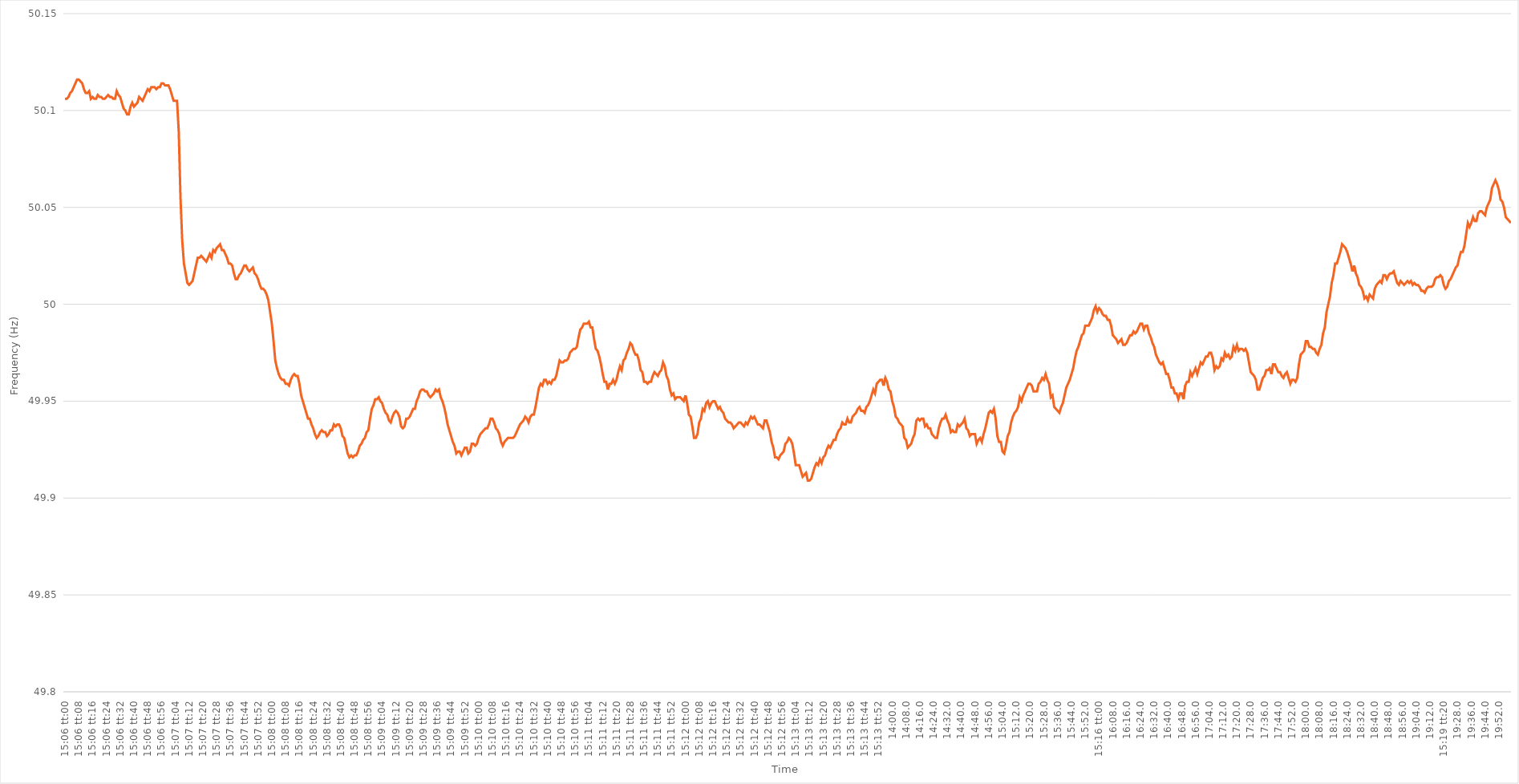
| Category | Series 0 |
|---|---|
| 0.6291666666666667 | 50.106 |
| 0.6291782407407408 | 50.106 |
| 0.6291898148148148 | 50.107 |
| 0.6292013888888889 | 50.109 |
| 0.6292129629629629 | 50.11 |
| 0.6292245370370371 | 50.112 |
| 0.6292361111111111 | 50.114 |
| 0.6292476851851853 | 50.116 |
| 0.6292592592592593 | 50.116 |
| 0.6292708333333333 | 50.115 |
| 0.6292824074074074 | 50.114 |
| 0.6292939814814814 | 50.111 |
| 0.6293055555555556 | 50.109 |
| 0.6293171296296296 | 50.109 |
| 0.6293287037037038 | 50.11 |
| 0.6293402777777778 | 50.106 |
| 0.6293518518518518 | 50.107 |
| 0.6293634259259259 | 50.106 |
| 0.629375 | 50.106 |
| 0.6293865740740741 | 50.108 |
| 0.6293981481481482 | 50.107 |
| 0.6294097222222222 | 50.107 |
| 0.6294212962962963 | 50.106 |
| 0.6294328703703703 | 50.106 |
| 0.6294444444444445 | 50.107 |
| 0.6294560185185185 | 50.108 |
| 0.6294675925925927 | 50.107 |
| 0.6294791666666667 | 50.107 |
| 0.6294907407407407 | 50.106 |
| 0.6295023148148148 | 50.106 |
| 0.6295138888888888 | 50.11 |
| 0.629525462962963 | 50.108 |
| 0.629537037037037 | 50.107 |
| 0.6295486111111112 | 50.104 |
| 0.6295601851851852 | 50.101 |
| 0.6295717592592592 | 50.1 |
| 0.6295833333333333 | 50.098 |
| 0.6295949074074074 | 50.098 |
| 0.6296064814814815 | 50.102 |
| 0.6296180555555556 | 50.104 |
| 0.6296296296296297 | 50.102 |
| 0.6296412037037037 | 50.103 |
| 0.6296527777777777 | 50.104 |
| 0.6296643518518519 | 50.107 |
| 0.6296759259259259 | 50.106 |
| 0.6296875000000001 | 50.105 |
| 0.6296990740740741 | 50.107 |
| 0.6297106481481481 | 50.109 |
| 0.6297222222222222 | 50.111 |
| 0.6297337962962963 | 50.11 |
| 0.6297453703703704 | 50.112 |
| 0.6297569444444444 | 50.112 |
| 0.6297685185185186 | 50.112 |
| 0.6297800925925926 | 50.111 |
| 0.6297916666666666 | 50.112 |
| 0.6298032407407407 | 50.112 |
| 0.6298148148148148 | 50.114 |
| 0.6298263888888889 | 50.114 |
| 0.629837962962963 | 50.113 |
| 0.629849537037037 | 50.113 |
| 0.6298611111111111 | 50.113 |
| 0.6298726851851851 | 50.111 |
| 0.6298842592592593 | 50.108 |
| 0.6298958333333333 | 50.105 |
| 0.6299074074074075 | 50.105 |
| 0.6299189814814815 | 50.105 |
| 0.6299305555555555 | 50.089 |
| 0.6299421296296296 | 50.055 |
| 0.6299537037037037 | 50.033 |
| 0.6299652777777778 | 50.021 |
| 0.6299768518518518 | 50.016 |
| 0.629988425925926 | 50.011 |
| 0.63 | 50.01 |
| 0.630011574074074 | 50.011 |
| 0.6300231481481481 | 50.012 |
| 0.6300347222222222 | 50.016 |
| 0.6300462962962963 | 50.02 |
| 0.6300578703703704 | 50.024 |
| 0.6300694444444445 | 50.024 |
| 0.6300810185185185 | 50.025 |
| 0.6300925925925925 | 50.024 |
| 0.6301041666666667 | 50.023 |
| 0.6301157407407407 | 50.022 |
| 0.6301273148148149 | 50.024 |
| 0.6301388888888889 | 50.026 |
| 0.630150462962963 | 50.024 |
| 0.630162037037037 | 50.028 |
| 0.6301736111111111 | 50.027 |
| 0.6301851851851852 | 50.029 |
| 0.6301967592592593 | 50.03 |
| 0.6302083333333334 | 50.031 |
| 0.6302199074074074 | 50.028 |
| 0.6302314814814814 | 50.028 |
| 0.6302430555555555 | 50.026 |
| 0.6302546296296296 | 50.024 |
| 0.6302662037037037 | 50.021 |
| 0.6302777777777778 | 50.021 |
| 0.6302893518518519 | 50.02 |
| 0.6303009259259259 | 50.016 |
| 0.6303124999999999 | 50.013 |
| 0.6303240740740741 | 50.013 |
| 0.6303356481481481 | 50.015 |
| 0.6303472222222223 | 50.016 |
| 0.6303587962962963 | 50.018 |
| 0.6303703703703704 | 50.02 |
| 0.6303819444444444 | 50.02 |
| 0.6303935185185185 | 50.018 |
| 0.6304050925925926 | 50.017 |
| 0.6304166666666667 | 50.018 |
| 0.6304282407407408 | 50.019 |
| 0.6304398148148148 | 50.016 |
| 0.6304513888888889 | 50.015 |
| 0.6304629629629629 | 50.013 |
| 0.630474537037037 | 50.01 |
| 0.6304861111111111 | 50.008 |
| 0.6304976851851852 | 50.008 |
| 0.6305092592592593 | 50.007 |
| 0.6305208333333333 | 50.005 |
| 0.6305324074074073 | 50.002 |
| 0.6305439814814815 | 49.996 |
| 0.6305555555555555 | 49.99 |
| 0.6305671296296297 | 49.981 |
| 0.6305787037037037 | 49.971 |
| 0.6305902777777778 | 49.967 |
| 0.6306018518518518 | 49.964 |
| 0.630613425925926 | 49.962 |
| 0.630625 | 49.961 |
| 0.6306365740740741 | 49.961 |
| 0.6306481481481482 | 49.959 |
| 0.6306597222222222 | 49.959 |
| 0.6306712962962963 | 49.958 |
| 0.6306828703703703 | 49.961 |
| 0.6306944444444444 | 49.963 |
| 0.6307060185185185 | 49.964 |
| 0.6307175925925926 | 49.963 |
| 0.6307291666666667 | 49.963 |
| 0.6307407407407407 | 49.959 |
| 0.6307523148148148 | 49.953 |
| 0.6307638888888889 | 49.95 |
| 0.6307754629629629 | 49.947 |
| 0.6307870370370371 | 49.944 |
| 0.6307986111111111 | 49.941 |
| 0.6308101851851852 | 49.941 |
| 0.6308217592592592 | 49.938 |
| 0.6308333333333334 | 49.936 |
| 0.6308449074074074 | 49.933 |
| 0.6308564814814815 | 49.931 |
| 0.6308680555555556 | 49.932 |
| 0.6308796296296296 | 49.934 |
| 0.6308912037037037 | 49.935 |
| 0.6309027777777778 | 49.934 |
| 0.6309143518518519 | 49.934 |
| 0.6309259259259259 | 49.932 |
| 0.6309375 | 49.933 |
| 0.6309490740740741 | 49.935 |
| 0.6309606481481481 | 49.935 |
| 0.6309722222222222 | 49.938 |
| 0.6309837962962963 | 49.937 |
| 0.6309953703703703 | 49.938 |
| 0.6310069444444445 | 49.938 |
| 0.6310185185185185 | 49.936 |
| 0.6310300925925926 | 49.932 |
| 0.6310416666666666 | 49.931 |
| 0.6310532407407408 | 49.927 |
| 0.6310648148148148 | 49.923 |
| 0.631076388888889 | 49.921 |
| 0.631087962962963 | 49.922 |
| 0.631099537037037 | 49.921 |
| 0.6311111111111111 | 49.922 |
| 0.6311226851851852 | 49.922 |
| 0.6311342592592593 | 49.924 |
| 0.6311458333333334 | 49.927 |
| 0.6311574074074074 | 49.928 |
| 0.6311689814814815 | 49.93 |
| 0.6311805555555555 | 49.931 |
| 0.6311921296296296 | 49.934 |
| 0.6312037037037037 | 49.935 |
| 0.6312152777777778 | 49.941 |
| 0.6312268518518519 | 49.946 |
| 0.6312384259259259 | 49.948 |
| 0.63125 | 49.951 |
| 0.631261574074074 | 49.951 |
| 0.6312731481481482 | 49.952 |
| 0.6312847222222222 | 49.95 |
| 0.6312962962962964 | 49.949 |
| 0.6313078703703704 | 49.946 |
| 0.6313194444444444 | 49.944 |
| 0.6313310185185185 | 49.943 |
| 0.6313425925925926 | 49.94 |
| 0.6313541666666667 | 49.939 |
| 0.6313657407407408 | 49.942 |
| 0.6313773148148148 | 49.944 |
| 0.6313888888888889 | 49.945 |
| 0.6314004629629629 | 49.944 |
| 0.631412037037037 | 49.942 |
| 0.6314236111111111 | 49.937 |
| 0.6314351851851852 | 49.936 |
| 0.6314467592592593 | 49.937 |
| 0.6314583333333333 | 49.941 |
| 0.6314699074074074 | 49.941 |
| 0.6314814814814814 | 49.942 |
| 0.6314930555555556 | 49.944 |
| 0.6315046296296296 | 49.946 |
| 0.6315162037037038 | 49.946 |
| 0.6315277777777778 | 49.95 |
| 0.6315393518518518 | 49.952 |
| 0.6315509259259259 | 49.955 |
| 0.6315625 | 49.956 |
| 0.6315740740740741 | 49.956 |
| 0.6315856481481482 | 49.955 |
| 0.6315972222222223 | 49.955 |
| 0.6316087962962963 | 49.953 |
| 0.6316203703703703 | 49.952 |
| 0.6316319444444445 | 49.953 |
| 0.6316435185185185 | 49.954 |
| 0.6316550925925926 | 49.956 |
| 0.6316666666666667 | 49.955 |
| 0.6316782407407407 | 49.956 |
| 0.6316898148148148 | 49.952 |
| 0.6317013888888888 | 49.95 |
| 0.631712962962963 | 49.947 |
| 0.631724537037037 | 49.943 |
| 0.6317361111111112 | 49.938 |
| 0.6317476851851852 | 49.935 |
| 0.6317592592592592 | 49.932 |
| 0.6317708333333333 | 49.929 |
| 0.6317824074074074 | 49.927 |
| 0.6317939814814815 | 49.923 |
| 0.6318055555555556 | 49.924 |
| 0.6318171296296297 | 49.924 |
| 0.6318287037037037 | 49.922 |
| 0.6318402777777777 | 49.924 |
| 0.6318518518518519 | 49.926 |
| 0.6318634259259259 | 49.926 |
| 0.631875 | 49.923 |
| 0.6318865740740741 | 49.924 |
| 0.6318981481481482 | 49.928 |
| 0.6319097222222222 | 49.928 |
| 0.6319212962962962 | 49.927 |
| 0.6319328703703704 | 49.928 |
| 0.6319444444444444 | 49.931 |
| 0.6319560185185186 | 49.933 |
| 0.6319675925925926 | 49.934 |
| 0.6319791666666666 | 49.935 |
| 0.6319907407407407 | 49.936 |
| 0.6320023148148148 | 49.936 |
| 0.6320138888888889 | 49.938 |
| 0.632025462962963 | 49.941 |
| 0.6320370370370371 | 49.941 |
| 0.6320486111111111 | 49.939 |
| 0.6320601851851851 | 49.936 |
| 0.6320717592592593 | 49.935 |
| 0.6320833333333333 | 49.933 |
| 0.6320949074074075 | 49.929 |
| 0.6321064814814815 | 49.927 |
| 0.6321180555555556 | 49.929 |
| 0.6321296296296296 | 49.93 |
| 0.6321412037037036 | 49.931 |
| 0.6321527777777778 | 49.931 |
| 0.6321643518518518 | 49.931 |
| 0.632175925925926 | 49.931 |
| 0.6321875 | 49.932 |
| 0.632199074074074 | 49.934 |
| 0.6322106481481481 | 49.936 |
| 0.6322222222222222 | 49.938 |
| 0.6322337962962963 | 49.939 |
| 0.6322453703703704 | 49.94 |
| 0.6322569444444445 | 49.942 |
| 0.6322685185185185 | 49.941 |
| 0.6322800925925925 | 49.939 |
| 0.6322916666666667 | 49.942 |
| 0.6323032407407407 | 49.943 |
| 0.6323148148148149 | 49.943 |
| 0.6323263888888889 | 49.947 |
| 0.632337962962963 | 49.952 |
| 0.632349537037037 | 49.957 |
| 0.632361111111111 | 49.959 |
| 0.6323726851851852 | 49.958 |
| 0.6323842592592592 | 49.961 |
| 0.6323958333333334 | 49.961 |
| 0.6324074074074074 | 49.959 |
| 0.6324189814814815 | 49.96 |
| 0.6324305555555555 | 49.959 |
| 0.6324421296296296 | 49.961 |
| 0.6324537037037037 | 49.961 |
| 0.6324652777777778 | 49.963 |
| 0.6324768518518519 | 49.967 |
| 0.6324884259259259 | 49.971 |
| 0.6325 | 49.97 |
| 0.6325115740740741 | 49.97 |
| 0.6325231481481481 | 49.971 |
| 0.6325347222222223 | 49.971 |
| 0.6325462962962963 | 49.972 |
| 0.6325578703703704 | 49.975 |
| 0.6325694444444444 | 49.976 |
| 0.6325810185185184 | 49.977 |
| 0.6325925925925926 | 49.977 |
| 0.6326041666666666 | 49.978 |
| 0.6326157407407408 | 49.983 |
| 0.6326273148148148 | 49.987 |
| 0.6326388888888889 | 49.988 |
| 0.6326504629629629 | 49.99 |
| 0.632662037037037 | 49.99 |
| 0.6326736111111111 | 49.99 |
| 0.6326851851851852 | 49.991 |
| 0.6326967592592593 | 49.988 |
| 0.6327083333333333 | 49.988 |
| 0.6327199074074074 | 49.982 |
| 0.6327314814814815 | 49.977 |
| 0.6327430555555555 | 49.976 |
| 0.6327546296296297 | 49.973 |
| 0.6327662037037037 | 49.969 |
| 0.6327777777777778 | 49.964 |
| 0.6327893518518518 | 49.96 |
| 0.632800925925926 | 49.96 |
| 0.6328125 | 49.956 |
| 0.632824074074074 | 49.959 |
| 0.6328356481481482 | 49.959 |
| 0.6328472222222222 | 49.961 |
| 0.6328587962962963 | 49.959 |
| 0.6328703703703703 | 49.961 |
| 0.6328819444444445 | 49.965 |
| 0.6328935185185185 | 49.968 |
| 0.6329050925925926 | 49.966 |
| 0.6329166666666667 | 49.971 |
| 0.6329282407407407 | 49.972 |
| 0.6329398148148148 | 49.975 |
| 0.6329513888888889 | 49.977 |
| 0.632962962962963 | 49.98 |
| 0.6329745370370371 | 49.979 |
| 0.6329861111111111 | 49.976 |
| 0.6329976851851852 | 49.974 |
| 0.6330092592592592 | 49.974 |
| 0.6330208333333334 | 49.971 |
| 0.6330324074074074 | 49.966 |
| 0.6330439814814816 | 49.965 |
| 0.6330555555555556 | 49.96 |
| 0.6330671296296296 | 49.96 |
| 0.6330787037037037 | 49.959 |
| 0.6330902777777777 | 49.96 |
| 0.6331018518518519 | 49.96 |
| 0.6331134259259259 | 49.963 |
| 0.633125 | 49.965 |
| 0.6331365740740741 | 49.964 |
| 0.6331481481481481 | 49.963 |
| 0.6331597222222222 | 49.965 |
| 0.6331712962962963 | 49.966 |
| 0.6331828703703704 | 49.97 |
| 0.6331944444444445 | 49.968 |
| 0.6332060185185185 | 49.963 |
| 0.6332175925925926 | 49.961 |
| 0.6332291666666666 | 49.956 |
| 0.6332407407407408 | 49.953 |
| 0.6332523148148148 | 49.954 |
| 0.633263888888889 | 49.951 |
| 0.633275462962963 | 49.952 |
| 0.633287037037037 | 49.952 |
| 0.6332986111111111 | 49.952 |
| 0.6333101851851851 | 49.951 |
| 0.6333217592592593 | 49.95 |
| 0.6333333333333333 | 49.953 |
| 0.6333449074074075 | 49.949 |
| 0.6333564814814815 | 49.943 |
| 0.6333680555555555 | 49.942 |
| 0.6333796296296296 | 49.937 |
| 0.6333912037037037 | 49.931 |
| 0.6334027777777778 | 49.931 |
| 0.6334143518518519 | 49.933 |
| 0.633425925925926 | 49.939 |
| 0.6334375 | 49.941 |
| 0.633449074074074 | 49.946 |
| 0.6334606481481482 | 49.945 |
| 0.6334722222222222 | 49.949 |
| 0.6334837962962964 | 49.95 |
| 0.6334953703703704 | 49.947 |
| 0.6335069444444444 | 49.949 |
| 0.6335185185185185 | 49.95 |
| 0.6335300925925925 | 49.95 |
| 0.6335416666666667 | 49.948 |
| 0.6335532407407407 | 49.946 |
| 0.6335648148148149 | 49.947 |
| 0.6335763888888889 | 49.945 |
| 0.6335879629629629 | 49.944 |
| 0.633599537037037 | 49.941 |
| 0.6336111111111111 | 49.94 |
| 0.6336226851851852 | 49.939 |
| 0.6336342592592593 | 49.939 |
| 0.6336458333333334 | 49.938 |
| 0.6336574074074074 | 49.936 |
| 0.6336689814814814 | 49.937 |
| 0.6336805555555556 | 49.938 |
| 0.6336921296296296 | 49.939 |
| 0.6337037037037038 | 49.939 |
| 0.6337152777777778 | 49.938 |
| 0.6337268518518518 | 49.937 |
| 0.6337384259259259 | 49.939 |
| 0.63375 | 49.938 |
| 0.6337615740740741 | 49.94 |
| 0.6337731481481481 | 49.942 |
| 0.6337847222222223 | 49.941 |
| 0.6337962962962963 | 49.942 |
| 0.6338078703703703 | 49.94 |
| 0.6338194444444444 | 49.938 |
| 0.6338310185185185 | 49.938 |
| 0.6338425925925926 | 49.937 |
| 0.6338541666666667 | 49.936 |
| 0.6338657407407408 | 49.94 |
| 0.6338773148148148 | 49.94 |
| 0.6338888888888888 | 49.937 |
| 0.633900462962963 | 49.934 |
| 0.633912037037037 | 49.929 |
| 0.6339236111111112 | 49.926 |
| 0.6339351851851852 | 49.921 |
| 0.6339467592592593 | 49.921 |
| 0.6339583333333333 | 49.92 |
| 0.6339699074074074 | 49.922 |
| 0.6339814814814815 | 49.923 |
| 0.6339930555555555 | 49.924 |
| 0.6340046296296297 | 49.928 |
| 0.6340162037037037 | 49.929 |
| 0.6340277777777777 | 49.931 |
| 0.6340393518518518 | 49.93 |
| 0.6340509259259259 | 49.928 |
| 0.6340625 | 49.923 |
| 0.6340740740740741 | 49.917 |
| 0.6340856481481482 | 49.917 |
| 0.6340972222222222 | 49.917 |
| 0.6341087962962962 | 49.914 |
| 0.6341203703703704 | 49.911 |
| 0.6341319444444444 | 49.912 |
| 0.6341435185185186 | 49.913 |
| 0.6341550925925926 | 49.909 |
| 0.6341666666666667 | 49.909 |
| 0.6341782407407407 | 49.91 |
| 0.6341898148148148 | 49.913 |
| 0.6342013888888889 | 49.916 |
| 0.634212962962963 | 49.918 |
| 0.6342245370370371 | 49.917 |
| 0.6342361111111111 | 49.92 |
| 0.6342476851851852 | 49.918 |
| 0.6342592592592592 | 49.921 |
| 0.6342708333333333 | 49.922 |
| 0.6342824074074074 | 49.925 |
| 0.6342939814814815 | 49.927 |
| 0.6343055555555556 | 49.926 |
| 0.6343171296296296 | 49.928 |
| 0.6343287037037036 | 49.93 |
| 0.6343402777777778 | 49.93 |
| 0.6343518518518518 | 49.933 |
| 0.634363425925926 | 49.935 |
| 0.634375 | 49.936 |
| 0.6343865740740741 | 49.939 |
| 0.6343981481481481 | 49.938 |
| 0.6344097222222222 | 49.938 |
| 0.6344212962962963 | 49.941 |
| 0.6344328703703704 | 49.939 |
| 0.6344444444444445 | 49.939 |
| 0.6344560185185185 | 49.942 |
| 0.6344675925925926 | 49.943 |
| 0.6344791666666666 | 49.944 |
| 0.6344907407407407 | 49.946 |
| 0.6345023148148148 | 49.947 |
| 0.6345138888888889 | 49.945 |
| 0.634525462962963 | 49.945 |
| 0.634537037037037 | 49.944 |
| 0.634548611111111 | 49.947 |
| 0.6345601851851852 | 49.948 |
| 0.6345717592592592 | 49.95 |
| 0.6345833333333334 | 49.953 |
| 0.6345949074074074 | 49.956 |
| 0.6346064814814815 | 49.954 |
| 0.6346180555555555 | 49.959 |
| 0.6346296296296297 | 49.96 |
| 0.6346412037037037 | 49.961 |
| 0.6346527777777778 | 49.961 |
| 0.6346643518518519 | 49.958 |
| 0.6346759259259259 | 49.962 |
| 0.6346875 | 49.96 |
| 0.6346990740740741 | 49.956 |
| 0.6347106481481481 | 49.955 |
| 0.6347222222222222 | 49.95 |
| 0.6347337962962963 | 49.947 |
| 0.6347453703703704 | 49.942 |
| 0.6347569444444444 | 49.941 |
| 0.6347685185185185 | 49.939 |
| 0.6347800925925926 | 49.938 |
| 0.6347916666666666 | 49.937 |
| 0.6348032407407408 | 49.931 |
| 0.6348148148148148 | 49.93 |
| 0.6348263888888889 | 49.926 |
| 0.6348379629629629 | 49.927 |
| 0.6348495370370371 | 49.928 |
| 0.6348611111111111 | 49.931 |
| 0.6348726851851852 | 49.933 |
| 0.6348842592592593 | 49.94 |
| 0.6348958333333333 | 49.941 |
| 0.6349074074074074 | 49.94 |
| 0.6349189814814815 | 49.941 |
| 0.6349305555555556 | 49.941 |
| 0.6349421296296297 | 49.937 |
| 0.6349537037037037 | 49.938 |
| 0.6349652777777778 | 49.936 |
| 0.6349768518518518 | 49.936 |
| 0.6349884259259259 | 49.933 |
| 0.635 | 49.932 |
| 0.635011574074074 | 49.931 |
| 0.6350231481481482 | 49.931 |
| 0.6350347222222222 | 49.936 |
| 0.6350462962962963 | 49.939 |
| 0.6350578703703703 | 49.941 |
| 0.6350694444444445 | 49.941 |
| 0.6350810185185185 | 49.943 |
| 0.6350925925925927 | 49.94 |
| 0.6351041666666667 | 49.938 |
| 0.6351157407407407 | 49.934 |
| 0.6351273148148148 | 49.935 |
| 0.6351388888888889 | 49.934 |
| 0.635150462962963 | 49.934 |
| 0.6351620370370371 | 49.938 |
| 0.6351736111111111 | 49.937 |
| 0.6351851851851852 | 49.938 |
| 0.6351967592592592 | 49.939 |
| 0.6352083333333333 | 49.941 |
| 0.6352199074074074 | 49.936 |
| 0.6352314814814815 | 49.935 |
| 0.6352430555555556 | 49.932 |
| 0.6352546296296296 | 49.933 |
| 0.6352662037037037 | 49.933 |
| 0.6352777777777777 | 49.933 |
| 0.6352893518518519 | 49.928 |
| 0.6353009259259259 | 49.93 |
| 0.6353125000000001 | 49.931 |
| 0.6353240740740741 | 49.929 |
| 0.6353356481481481 | 49.933 |
| 0.6353472222222222 | 49.936 |
| 0.6353587962962963 | 49.94 |
| 0.6353703703703704 | 49.944 |
| 0.6353819444444445 | 49.945 |
| 0.6353935185185186 | 49.944 |
| 0.6354050925925926 | 49.946 |
| 0.6354166666666666 | 49.941 |
| 0.6354282407407407 | 49.932 |
| 0.6354398148148148 | 49.929 |
| 0.6354513888888889 | 49.929 |
| 0.635462962962963 | 49.924 |
| 0.635474537037037 | 49.923 |
| 0.6354861111111111 | 49.927 |
| 0.6354976851851851 | 49.932 |
| 0.6355092592592593 | 49.934 |
| 0.6355208333333333 | 49.939 |
| 0.6355324074074075 | 49.942 |
| 0.6355439814814815 | 49.944 |
| 0.6355555555555555 | 49.945 |
| 0.6355671296296296 | 49.947 |
| 0.6355787037037037 | 49.952 |
| 0.6355902777777778 | 49.95 |
| 0.6356018518518519 | 49.953 |
| 0.635613425925926 | 49.955 |
| 0.635625 | 49.957 |
| 0.635636574074074 | 49.959 |
| 0.6356481481481482 | 49.959 |
| 0.6356597222222222 | 49.958 |
| 0.6356712962962963 | 49.955 |
| 0.6356828703703704 | 49.955 |
| 0.6356944444444445 | 49.955 |
| 0.6357060185185185 | 49.959 |
| 0.6357175925925925 | 49.96 |
| 0.6357291666666667 | 49.962 |
| 0.6357407407407407 | 49.961 |
| 0.6357523148148149 | 49.964 |
| 0.6357638888888889 | 49.961 |
| 0.635775462962963 | 49.959 |
| 0.635787037037037 | 49.952 |
| 0.6357986111111111 | 49.953 |
| 0.6358101851851852 | 49.947 |
| 0.6358217592592593 | 49.946 |
| 0.6358333333333334 | 49.945 |
| 0.6358449074074074 | 49.944 |
| 0.6358564814814814 | 49.947 |
| 0.6358680555555556 | 49.949 |
| 0.6358796296296296 | 49.953 |
| 0.6358912037037037 | 49.957 |
| 0.6359027777777778 | 49.959 |
| 0.6359143518518519 | 49.961 |
| 0.6359259259259259 | 49.964 |
| 0.6359374999999999 | 49.967 |
| 0.6359490740740741 | 49.972 |
| 0.6359606481481481 | 49.976 |
| 0.6359722222222223 | 49.978 |
| 0.6359837962962963 | 49.981 |
| 0.6359953703703703 | 49.984 |
| 0.6360069444444444 | 49.985 |
| 0.6360185185185185 | 49.989 |
| 0.6360300925925926 | 49.989 |
| 0.6360416666666667 | 49.989 |
| 0.6360532407407408 | 49.991 |
| 0.6360648148148148 | 49.993 |
| 0.6360763888888888 | 49.997 |
| 0.636087962962963 | 49.999 |
| 0.636099537037037 | 49.996 |
| 0.6361111111111112 | 49.998 |
| 0.6361226851851852 | 49.997 |
| 0.6361342592592593 | 49.995 |
| 0.6361458333333333 | 49.994 |
| 0.6361574074074073 | 49.994 |
| 0.6361689814814815 | 49.992 |
| 0.6361805555555555 | 49.992 |
| 0.6361921296296297 | 49.989 |
| 0.6362037037037037 | 49.984 |
| 0.6362152777777778 | 49.983 |
| 0.6362268518518518 | 49.982 |
| 0.6362384259259259 | 49.98 |
| 0.63625 | 49.981 |
| 0.6362615740740741 | 49.982 |
| 0.6362731481481482 | 49.979 |
| 0.6362847222222222 | 49.979 |
| 0.6362962962962962 | 49.98 |
| 0.6363078703703704 | 49.982 |
| 0.6363194444444444 | 49.984 |
| 0.6363310185185186 | 49.984 |
| 0.6363425925925926 | 49.986 |
| 0.6363541666666667 | 49.985 |
| 0.6363657407407407 | 49.986 |
| 0.6363773148148147 | 49.988 |
| 0.6363888888888889 | 49.99 |
| 0.6364004629629629 | 49.99 |
| 0.6364120370370371 | 49.987 |
| 0.6364236111111111 | 49.989 |
| 0.6364351851851852 | 49.989 |
| 0.6364467592592592 | 49.985 |
| 0.6364583333333333 | 49.983 |
| 0.6364699074074074 | 49.98 |
| 0.6364814814814815 | 49.978 |
| 0.6364930555555556 | 49.974 |
| 0.6365046296296296 | 49.972 |
| 0.6365162037037037 | 49.97 |
| 0.6365277777777778 | 49.969 |
| 0.6365393518518518 | 49.97 |
| 0.636550925925926 | 49.967 |
| 0.6365625 | 49.964 |
| 0.6365740740740741 | 49.964 |
| 0.6365856481481481 | 49.961 |
| 0.6365972222222221 | 49.957 |
| 0.6366087962962963 | 49.957 |
| 0.6366203703703703 | 49.954 |
| 0.6366319444444445 | 49.954 |
| 0.6366435185185185 | 49.951 |
| 0.6366550925925926 | 49.954 |
| 0.6366666666666666 | 49.954 |
| 0.6366782407407408 | 49.951 |
| 0.6366898148148148 | 49.958 |
| 0.6367013888888889 | 49.96 |
| 0.636712962962963 | 49.96 |
| 0.636724537037037 | 49.965 |
| 0.6367361111111111 | 49.963 |
| 0.6367476851851852 | 49.965 |
| 0.6367592592592592 | 49.967 |
| 0.6367708333333334 | 49.964 |
| 0.6367824074074074 | 49.967 |
| 0.6367939814814815 | 49.97 |
| 0.6368055555555555 | 49.969 |
| 0.6368171296296297 | 49.971 |
| 0.6368287037037037 | 49.973 |
| 0.6368402777777779 | 49.973 |
| 0.6368518518518519 | 49.975 |
| 0.6368634259259259 | 49.975 |
| 0.636875 | 49.972 |
| 0.636886574074074 | 49.966 |
| 0.6368981481481482 | 49.968 |
| 0.6369097222222222 | 49.967 |
| 0.6369212962962963 | 49.968 |
| 0.6369328703703704 | 49.972 |
| 0.6369444444444444 | 49.971 |
| 0.6369560185185185 | 49.975 |
| 0.6369675925925926 | 49.973 |
| 0.6369791666666667 | 49.974 |
| 0.6369907407407408 | 49.972 |
| 0.6370023148148148 | 49.973 |
| 0.6370138888888889 | 49.978 |
| 0.6370254629629629 | 49.976 |
| 0.6370370370370371 | 49.979 |
| 0.6370486111111111 | 49.976 |
| 0.6370601851851853 | 49.977 |
| 0.6370717592592593 | 49.977 |
| 0.6370833333333333 | 49.976 |
| 0.6370949074074074 | 49.977 |
| 0.6371064814814814 | 49.975 |
| 0.6371180555555556 | 49.97 |
| 0.6371296296296296 | 49.965 |
| 0.6371412037037038 | 49.964 |
| 0.6371527777777778 | 49.963 |
| 0.6371643518518518 | 49.961 |
| 0.6371759259259259 | 49.956 |
| 0.6371875 | 49.956 |
| 0.6371990740740741 | 49.959 |
| 0.6372106481481482 | 49.962 |
| 0.6372222222222222 | 49.963 |
| 0.6372337962962963 | 49.966 |
| 0.6372453703703703 | 49.966 |
| 0.6372569444444445 | 49.967 |
| 0.6372685185185185 | 49.964 |
| 0.6372800925925927 | 49.969 |
| 0.6372916666666667 | 49.969 |
| 0.6373032407407407 | 49.967 |
| 0.6373148148148148 | 49.965 |
| 0.6373263888888888 | 49.965 |
| 0.637337962962963 | 49.963 |
| 0.637349537037037 | 49.962 |
| 0.6373611111111112 | 49.964 |
| 0.6373726851851852 | 49.965 |
| 0.6373842592592592 | 49.962 |
| 0.6373958333333333 | 49.959 |
| 0.6374074074074074 | 49.961 |
| 0.6374189814814815 | 49.961 |
| 0.6374305555555556 | 49.96 |
| 0.6374421296296297 | 49.962 |
| 0.6374537037037037 | 49.969 |
| 0.6374652777777777 | 49.974 |
| 0.6374768518518519 | 49.975 |
| 0.6374884259259259 | 49.976 |
| 0.6375000000000001 | 49.981 |
| 0.6375115740740741 | 49.981 |
| 0.6375231481481481 | 49.978 |
| 0.6375347222222222 | 49.978 |
| 0.6375462962962963 | 49.977 |
| 0.6375578703703704 | 49.977 |
| 0.6375694444444444 | 49.975 |
| 0.6375810185185186 | 49.974 |
| 0.6375925925925926 | 49.977 |
| 0.6376041666666666 | 49.979 |
| 0.6376157407407407 | 49.985 |
| 0.6376273148148148 | 49.988 |
| 0.6376388888888889 | 49.996 |
| 0.637650462962963 | 50 |
| 0.637662037037037 | 50.004 |
| 0.6376736111111111 | 50.011 |
| 0.6376851851851851 | 50.015 |
| 0.6376967592592593 | 50.021 |
| 0.6377083333333333 | 50.021 |
| 0.6377199074074075 | 50.024 |
| 0.6377314814814815 | 50.027 |
| 0.6377430555555555 | 50.031 |
| 0.6377546296296296 | 50.03 |
| 0.6377662037037037 | 50.029 |
| 0.6377777777777778 | 50.027 |
| 0.6377893518518518 | 50.024 |
| 0.637800925925926 | 50.021 |
| 0.6378125 | 50.017 |
| 0.637824074074074 | 50.02 |
| 0.6378356481481481 | 50.016 |
| 0.6378472222222222 | 50.014 |
| 0.6378587962962963 | 50.01 |
| 0.6378703703703704 | 50.009 |
| 0.6378819444444445 | 50.007 |
| 0.6378935185185185 | 50.003 |
| 0.6379050925925925 | 50.004 |
| 0.6379166666666667 | 50.002 |
| 0.6379282407407407 | 50.005 |
| 0.6379398148148149 | 50.004 |
| 0.6379513888888889 | 50.003 |
| 0.637962962962963 | 50.008 |
| 0.637974537037037 | 50.01 |
| 0.6379861111111111 | 50.011 |
| 0.6379976851851852 | 50.012 |
| 0.6380092592592593 | 50.011 |
| 0.6380208333333334 | 50.015 |
| 0.6380324074074074 | 50.015 |
| 0.6380439814814814 | 50.013 |
| 0.6380555555555555 | 50.015 |
| 0.6380671296296296 | 50.016 |
| 0.6380787037037037 | 50.016 |
| 0.6380902777777778 | 50.017 |
| 0.6381018518518519 | 50.014 |
| 0.6381134259259259 | 50.011 |
| 0.6381249999999999 | 50.01 |
| 0.6381365740740741 | 50.012 |
| 0.6381481481481481 | 50.011 |
| 0.6381597222222223 | 50.01 |
| 0.6381712962962963 | 50.011 |
| 0.6381828703703704 | 50.012 |
| 0.6381944444444444 | 50.011 |
| 0.6382060185185185 | 50.012 |
| 0.6382175925925926 | 50.01 |
| 0.6382291666666667 | 50.011 |
| 0.6382407407407408 | 50.01 |
| 0.6382523148148148 | 50.01 |
| 0.6382638888888889 | 50.009 |
| 0.6382754629629629 | 50.007 |
| 0.638287037037037 | 50.007 |
| 0.6382986111111111 | 50.006 |
| 0.6383101851851852 | 50.008 |
| 0.6383217592592593 | 50.009 |
| 0.6383333333333333 | 50.009 |
| 0.6383449074074073 | 50.009 |
| 0.6383564814814815 | 50.01 |
| 0.6383680555555555 | 50.013 |
| 0.6383796296296297 | 50.014 |
| 0.6383912037037037 | 50.014 |
| 0.6384027777777778 | 50.015 |
| 0.6384143518518518 | 50.014 |
| 0.638425925925926 | 50.01 |
| 0.6384375 | 50.008 |
| 0.6384490740740741 | 50.009 |
| 0.6384606481481482 | 50.012 |
| 0.6384722222222222 | 50.013 |
| 0.6384837962962963 | 50.015 |
| 0.6384953703703703 | 50.017 |
| 0.6385069444444444 | 50.019 |
| 0.6385185185185185 | 50.02 |
| 0.6385300925925926 | 50.024 |
| 0.6385416666666667 | 50.027 |
| 0.6385532407407407 | 50.027 |
| 0.6385648148148148 | 50.03 |
| 0.6385763888888889 | 50.036 |
| 0.6385879629629629 | 50.042 |
| 0.6385995370370371 | 50.04 |
| 0.6386111111111111 | 50.042 |
| 0.6386226851851852 | 50.045 |
| 0.6386342592592592 | 50.043 |
| 0.6386458333333334 | 50.043 |
| 0.6386574074074074 | 50.047 |
| 0.6386689814814815 | 50.048 |
| 0.6386805555555556 | 50.048 |
| 0.6386921296296296 | 50.047 |
| 0.6387037037037037 | 50.046 |
| 0.6387152777777778 | 50.05 |
| 0.6387268518518519 | 50.052 |
| 0.638738425925926 | 50.054 |
| 0.63875 | 50.06 |
| 0.6387615740740741 | 50.062 |
| 0.6387731481481481 | 50.064 |
| 0.6387847222222222 | 50.062 |
| 0.6387962962962963 | 50.059 |
| 0.6388078703703703 | 50.054 |
| 0.6388194444444445 | 50.053 |
| 0.6388310185185185 | 50.05 |
| 0.6388425925925926 | 50.045 |
| 0.6388541666666666 | 50.044 |
| 0.6388657407407408 | 50.043 |
| 0.6388773148148148 | 50.042 |